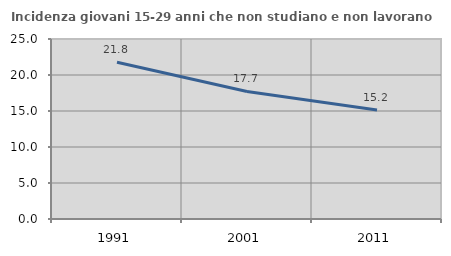
| Category | Incidenza giovani 15-29 anni che non studiano e non lavorano  |
|---|---|
| 1991.0 | 21.759 |
| 2001.0 | 17.718 |
| 2011.0 | 15.152 |